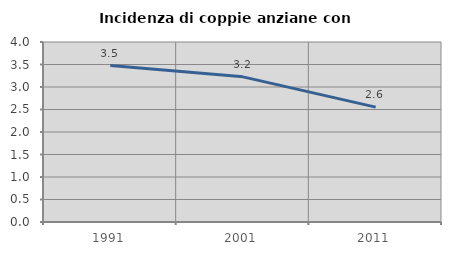
| Category | Incidenza di coppie anziane con figli |
|---|---|
| 1991.0 | 3.476 |
| 2001.0 | 3.226 |
| 2011.0 | 2.553 |